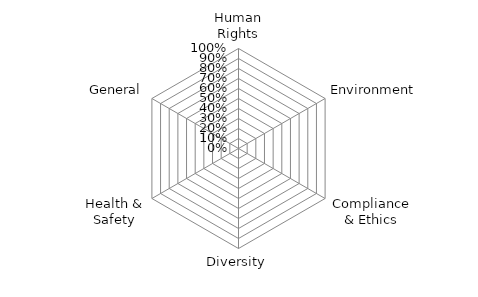
| Category | Series 0 |
|---|---|
| Human Rights | 0 |
| Environment | 0 |
| Compliance & Ethics | 0 |
| Diversity | 0 |
| Health & Safety | 0 |
| General | 0 |